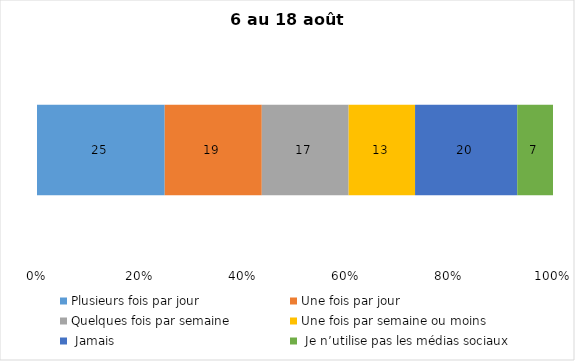
| Category | Plusieurs fois par jour | Une fois par jour | Quelques fois par semaine   | Une fois par semaine ou moins   |  Jamais   |  Je n’utilise pas les médias sociaux |
|---|---|---|---|---|---|---|
| 0 | 25 | 19 | 17 | 13 | 20 | 7 |